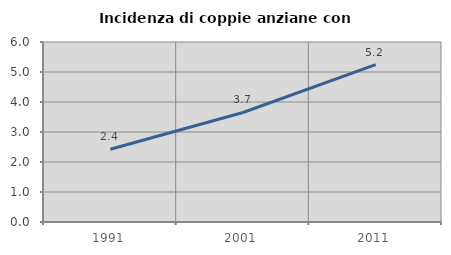
| Category | Incidenza di coppie anziane con figli |
|---|---|
| 1991.0 | 2.427 |
| 2001.0 | 3.651 |
| 2011.0 | 5.245 |